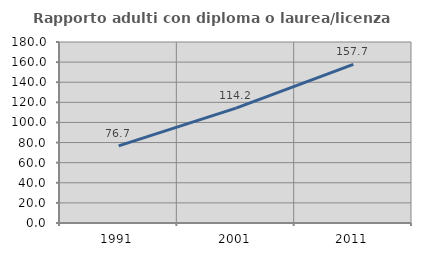
| Category | Rapporto adulti con diploma o laurea/licenza media  |
|---|---|
| 1991.0 | 76.722 |
| 2001.0 | 114.225 |
| 2011.0 | 157.731 |